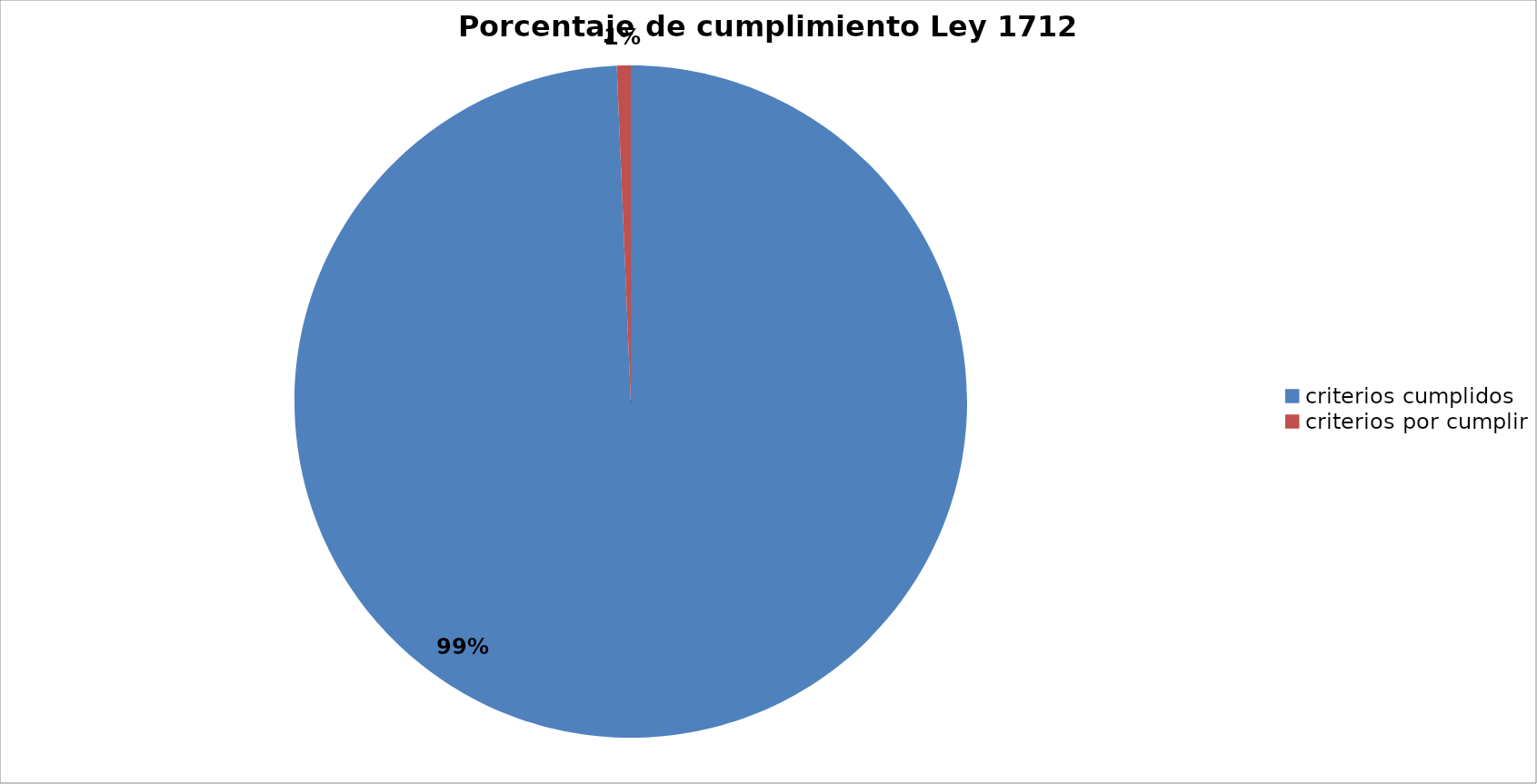
| Category | Series 0 |
|---|---|
| criterios cumplidos | 149 |
| criterios por cumplir | 1 |